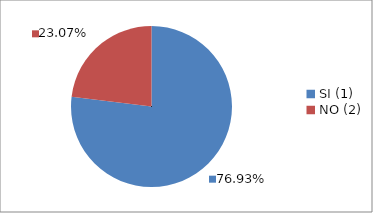
| Category | Series 0 |
|---|---|
| SI (1) | 0.769 |
| NO (2) | 0.231 |